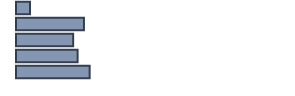
| Category | Series 0 |
|---|---|
| 0 | 5.135 |
| 1 | 24.794 |
| 2 | 20.86 |
| 3 | 22.478 |
| 4 | 26.876 |